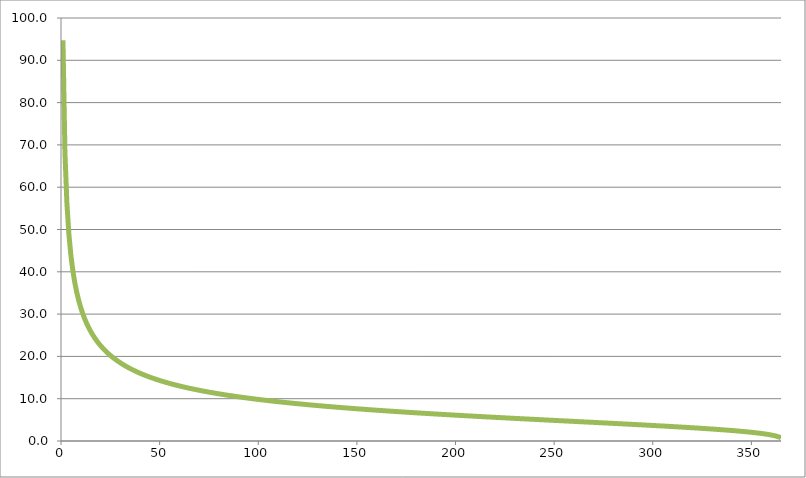
| Category | CURVA DI DURATA DELLE PORTATE (BURR) |
|---|---|
| 1.0 | 94.717 |
| 2.0 | 68.082 |
| 3.0 | 56.116 |
| 4.0 | 48.919 |
| 5.0 | 43.975 |
| 6.0 | 40.305 |
| 7.0 | 37.439 |
| 8.0 | 35.12 |
| 9.0 | 33.191 |
| 10.0 | 31.554 |
| 11.0 | 30.142 |
| 12.0 | 28.906 |
| 13.0 | 27.812 |
| 14.0 | 26.836 |
| 15.0 | 25.956 |
| 16.0 | 25.158 |
| 17.0 | 24.43 |
| 18.0 | 23.762 |
| 19.0 | 23.146 |
| 20.0 | 22.576 |
| 21.0 | 22.045 |
| 22.0 | 21.551 |
| 23.0 | 21.088 |
| 24.0 | 20.653 |
| 25.0 | 20.244 |
| 26.0 | 19.858 |
| 27.0 | 19.492 |
| 28.0 | 19.146 |
| 29.0 | 18.818 |
| 30.0 | 18.505 |
| 31.0 | 18.207 |
| 32.0 | 17.923 |
| 33.0 | 17.651 |
| 34.0 | 17.39 |
| 35.0 | 17.141 |
| 36.0 | 16.901 |
| 37.0 | 16.671 |
| 38.0 | 16.45 |
| 39.0 | 16.236 |
| 40.0 | 16.031 |
| 41.0 | 15.833 |
| 42.0 | 15.641 |
| 43.0 | 15.456 |
| 44.0 | 15.277 |
| 45.0 | 15.103 |
| 46.0 | 14.935 |
| 47.0 | 14.772 |
| 48.0 | 14.614 |
| 49.0 | 14.46 |
| 50.0 | 14.311 |
| 51.0 | 14.166 |
| 52.0 | 14.025 |
| 53.0 | 13.888 |
| 54.0 | 13.754 |
| 55.0 | 13.624 |
| 56.0 | 13.497 |
| 57.0 | 13.373 |
| 58.0 | 13.252 |
| 59.0 | 13.134 |
| 60.0 | 13.018 |
| 61.0 | 12.906 |
| 62.0 | 12.796 |
| 63.0 | 12.688 |
| 64.0 | 12.583 |
| 65.0 | 12.48 |
| 66.0 | 12.379 |
| 67.0 | 12.28 |
| 68.0 | 12.183 |
| 69.0 | 12.088 |
| 70.0 | 11.995 |
| 71.0 | 11.904 |
| 72.0 | 11.814 |
| 73.0 | 11.727 |
| 74.0 | 11.64 |
| 75.0 | 11.556 |
| 76.0 | 11.473 |
| 77.0 | 11.391 |
| 78.0 | 11.311 |
| 79.0 | 11.232 |
| 80.0 | 11.154 |
| 81.0 | 11.078 |
| 82.0 | 11.003 |
| 83.0 | 10.929 |
| 84.0 | 10.857 |
| 85.0 | 10.785 |
| 86.0 | 10.715 |
| 87.0 | 10.646 |
| 88.0 | 10.578 |
| 89.0 | 10.511 |
| 90.0 | 10.444 |
| 91.0 | 10.379 |
| 92.0 | 10.315 |
| 93.0 | 10.251 |
| 94.0 | 10.189 |
| 95.0 | 10.127 |
| 96.0 | 10.067 |
| 97.0 | 10.007 |
| 98.0 | 9.947 |
| 99.0 | 9.889 |
| 100.0 | 9.831 |
| 101.0 | 9.775 |
| 102.0 | 9.718 |
| 103.0 | 9.663 |
| 104.0 | 9.608 |
| 105.0 | 9.554 |
| 106.0 | 9.5 |
| 107.0 | 9.448 |
| 108.0 | 9.395 |
| 109.0 | 9.344 |
| 110.0 | 9.293 |
| 111.0 | 9.242 |
| 112.0 | 9.193 |
| 113.0 | 9.143 |
| 114.0 | 9.094 |
| 115.0 | 9.046 |
| 116.0 | 8.999 |
| 117.0 | 8.951 |
| 118.0 | 8.905 |
| 119.0 | 8.858 |
| 120.0 | 8.813 |
| 121.0 | 8.767 |
| 122.0 | 8.723 |
| 123.0 | 8.678 |
| 124.0 | 8.634 |
| 125.0 | 8.591 |
| 126.0 | 8.548 |
| 127.0 | 8.505 |
| 128.0 | 8.463 |
| 129.0 | 8.421 |
| 130.0 | 8.379 |
| 131.0 | 8.338 |
| 132.0 | 8.297 |
| 133.0 | 8.257 |
| 134.0 | 8.217 |
| 135.0 | 8.177 |
| 136.0 | 8.138 |
| 137.0 | 8.099 |
| 138.0 | 8.06 |
| 139.0 | 8.021 |
| 140.0 | 7.983 |
| 141.0 | 7.946 |
| 142.0 | 7.908 |
| 143.0 | 7.871 |
| 144.0 | 7.834 |
| 145.0 | 7.798 |
| 146.0 | 7.761 |
| 147.0 | 7.725 |
| 148.0 | 7.69 |
| 149.0 | 7.654 |
| 150.0 | 7.619 |
| 151.0 | 7.584 |
| 152.0 | 7.549 |
| 153.0 | 7.515 |
| 154.0 | 7.481 |
| 155.0 | 7.447 |
| 156.0 | 7.413 |
| 157.0 | 7.379 |
| 158.0 | 7.346 |
| 159.0 | 7.313 |
| 160.0 | 7.28 |
| 161.0 | 7.248 |
| 162.0 | 7.215 |
| 163.0 | 7.183 |
| 164.0 | 7.151 |
| 165.0 | 7.119 |
| 166.0 | 7.088 |
| 167.0 | 7.056 |
| 168.0 | 7.025 |
| 169.0 | 6.994 |
| 170.0 | 6.963 |
| 171.0 | 6.932 |
| 172.0 | 6.902 |
| 173.0 | 6.872 |
| 174.0 | 6.841 |
| 175.0 | 6.811 |
| 176.0 | 6.782 |
| 177.0 | 6.752 |
| 178.0 | 6.722 |
| 179.0 | 6.693 |
| 180.0 | 6.664 |
| 181.0 | 6.635 |
| 182.0 | 6.606 |
| 183.0 | 6.577 |
| 184.0 | 6.549 |
| 185.0 | 6.52 |
| 186.0 | 6.492 |
| 187.0 | 6.464 |
| 188.0 | 6.436 |
| 189.0 | 6.408 |
| 190.0 | 6.38 |
| 191.0 | 6.352 |
| 192.0 | 6.325 |
| 193.0 | 6.297 |
| 194.0 | 6.27 |
| 195.0 | 6.243 |
| 196.0 | 6.216 |
| 197.0 | 6.189 |
| 198.0 | 6.162 |
| 199.0 | 6.135 |
| 200.0 | 6.108 |
| 201.0 | 6.082 |
| 202.0 | 6.055 |
| 203.0 | 6.029 |
| 204.0 | 6.003 |
| 205.0 | 5.977 |
| 206.0 | 5.951 |
| 207.0 | 5.925 |
| 208.0 | 5.899 |
| 209.0 | 5.873 |
| 210.0 | 5.848 |
| 211.0 | 5.822 |
| 212.0 | 5.796 |
| 213.0 | 5.771 |
| 214.0 | 5.746 |
| 215.0 | 5.72 |
| 216.0 | 5.695 |
| 217.0 | 5.67 |
| 218.0 | 5.645 |
| 219.0 | 5.62 |
| 220.0 | 5.595 |
| 221.0 | 5.57 |
| 222.0 | 5.545 |
| 223.0 | 5.521 |
| 224.0 | 5.496 |
| 225.0 | 5.472 |
| 226.0 | 5.447 |
| 227.0 | 5.423 |
| 228.0 | 5.398 |
| 229.0 | 5.374 |
| 230.0 | 5.349 |
| 231.0 | 5.325 |
| 232.0 | 5.301 |
| 233.0 | 5.277 |
| 234.0 | 5.253 |
| 235.0 | 5.229 |
| 236.0 | 5.205 |
| 237.0 | 5.181 |
| 238.0 | 5.157 |
| 239.0 | 5.133 |
| 240.0 | 5.109 |
| 241.0 | 5.085 |
| 242.0 | 5.061 |
| 243.0 | 5.037 |
| 244.0 | 5.014 |
| 245.0 | 4.99 |
| 246.0 | 4.966 |
| 247.0 | 4.943 |
| 248.0 | 4.919 |
| 249.0 | 4.895 |
| 250.0 | 4.872 |
| 251.0 | 4.848 |
| 252.0 | 4.824 |
| 253.0 | 4.801 |
| 254.0 | 4.777 |
| 255.0 | 4.754 |
| 256.0 | 4.73 |
| 257.0 | 4.707 |
| 258.0 | 4.683 |
| 259.0 | 4.66 |
| 260.0 | 4.636 |
| 261.0 | 4.613 |
| 262.0 | 4.589 |
| 263.0 | 4.566 |
| 264.0 | 4.542 |
| 265.0 | 4.519 |
| 266.0 | 4.495 |
| 267.0 | 4.472 |
| 268.0 | 4.448 |
| 269.0 | 4.424 |
| 270.0 | 4.401 |
| 271.0 | 4.377 |
| 272.0 | 4.354 |
| 273.0 | 4.33 |
| 274.0 | 4.306 |
| 275.0 | 4.283 |
| 276.0 | 4.259 |
| 277.0 | 4.235 |
| 278.0 | 4.211 |
| 279.0 | 4.187 |
| 280.0 | 4.163 |
| 281.0 | 4.139 |
| 282.0 | 4.116 |
| 283.0 | 4.091 |
| 284.0 | 4.067 |
| 285.0 | 4.043 |
| 286.0 | 4.019 |
| 287.0 | 3.995 |
| 288.0 | 3.97 |
| 289.0 | 3.946 |
| 290.0 | 3.922 |
| 291.0 | 3.897 |
| 292.0 | 3.872 |
| 293.0 | 3.848 |
| 294.0 | 3.823 |
| 295.0 | 3.798 |
| 296.0 | 3.773 |
| 297.0 | 3.748 |
| 298.0 | 3.723 |
| 299.0 | 3.698 |
| 300.0 | 3.672 |
| 301.0 | 3.647 |
| 302.0 | 3.621 |
| 303.0 | 3.596 |
| 304.0 | 3.57 |
| 305.0 | 3.544 |
| 306.0 | 3.518 |
| 307.0 | 3.492 |
| 308.0 | 3.465 |
| 309.0 | 3.439 |
| 310.0 | 3.412 |
| 311.0 | 3.385 |
| 312.0 | 3.358 |
| 313.0 | 3.331 |
| 314.0 | 3.303 |
| 315.0 | 3.276 |
| 316.0 | 3.248 |
| 317.0 | 3.22 |
| 318.0 | 3.191 |
| 319.0 | 3.163 |
| 320.0 | 3.134 |
| 321.0 | 3.105 |
| 322.0 | 3.076 |
| 323.0 | 3.046 |
| 324.0 | 3.016 |
| 325.0 | 2.986 |
| 326.0 | 2.956 |
| 327.0 | 2.925 |
| 328.0 | 2.894 |
| 329.0 | 2.862 |
| 330.0 | 2.83 |
| 331.0 | 2.798 |
| 332.0 | 2.765 |
| 333.0 | 2.732 |
| 334.0 | 2.698 |
| 335.0 | 2.663 |
| 336.0 | 2.629 |
| 337.0 | 2.593 |
| 338.0 | 2.557 |
| 339.0 | 2.52 |
| 340.0 | 2.483 |
| 341.0 | 2.445 |
| 342.0 | 2.406 |
| 343.0 | 2.366 |
| 344.0 | 2.325 |
| 345.0 | 2.283 |
| 346.0 | 2.241 |
| 347.0 | 2.197 |
| 348.0 | 2.151 |
| 349.0 | 2.104 |
| 350.0 | 2.056 |
| 351.0 | 2.006 |
| 352.0 | 1.954 |
| 353.0 | 1.9 |
| 354.0 | 1.843 |
| 355.0 | 1.784 |
| 356.0 | 1.721 |
| 357.0 | 1.654 |
| 358.0 | 1.583 |
| 359.0 | 1.506 |
| 360.0 | 1.423 |
| 361.0 | 1.33 |
| 362.0 | 1.225 |
| 363.0 | 1.102 |
| 364.0 | 0.95 |
| 365.0 | 0.738 |